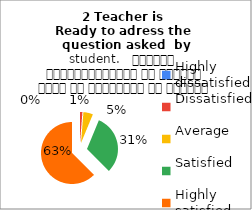
| Category | 2 Teacher is 
Ready to adress the  question asked  by student.   शिक्षक विद्यार्थियों के द्वारा पूछे गए प्रश्नों का समाधान करने हेतु तत्पर रहते हैं |
|---|---|
| Highly dissatisfied | 0 |
| Dissatisfied | 1 |
| Average | 4 |
| Satisfied | 25 |
| Highly satisfied | 50 |